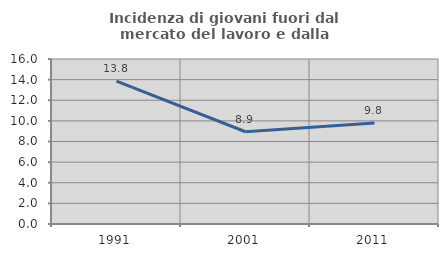
| Category | Incidenza di giovani fuori dal mercato del lavoro e dalla formazione  |
|---|---|
| 1991.0 | 13.846 |
| 2001.0 | 8.947 |
| 2011.0 | 9.79 |